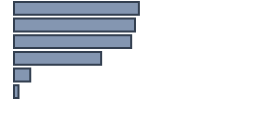
| Category | Percentatge |
|---|---|
| 0 | 52.033 |
| 1 | 50.412 |
| 2 | 48.823 |
| 3 | 36.311 |
| 4 | 6.755 |
| 5 | 1.875 |